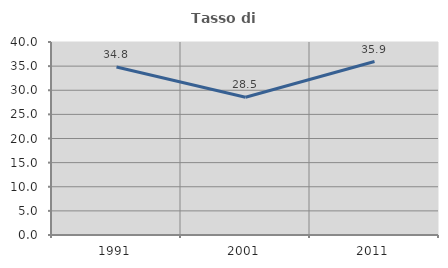
| Category | Tasso di occupazione   |
|---|---|
| 1991.0 | 34.812 |
| 2001.0 | 28.54 |
| 2011.0 | 35.946 |